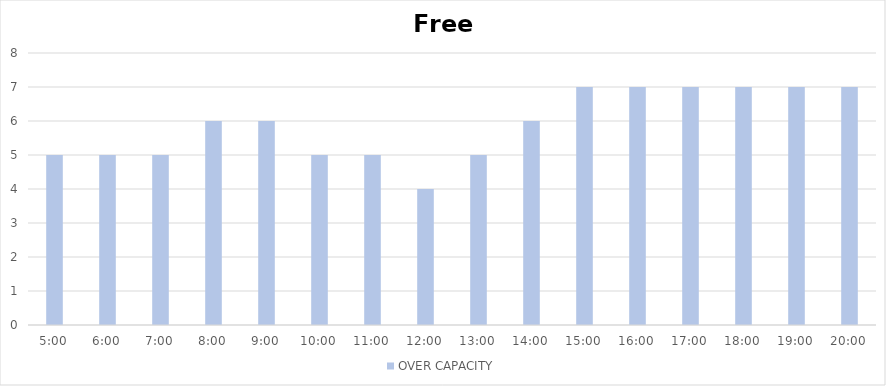
| Category | OVER CAPACITY |
|---|---|
| 0.20833333333333334 | 5 |
| 0.25 | 5 |
| 0.2916666666666667 | 5 |
| 0.3333333333333333 | 6 |
| 0.375 | 6 |
| 0.4166666666666667 | 5 |
| 0.4583333333333333 | 5 |
| 0.5 | 4 |
| 0.5416666666666666 | 5 |
| 0.5833333333333334 | 6 |
| 0.625 | 7 |
| 0.6666666666666666 | 7 |
| 0.7083333333333334 | 7 |
| 0.75 | 7 |
| 0.7916666666666666 | 7 |
| 0.8333333333333334 | 7 |